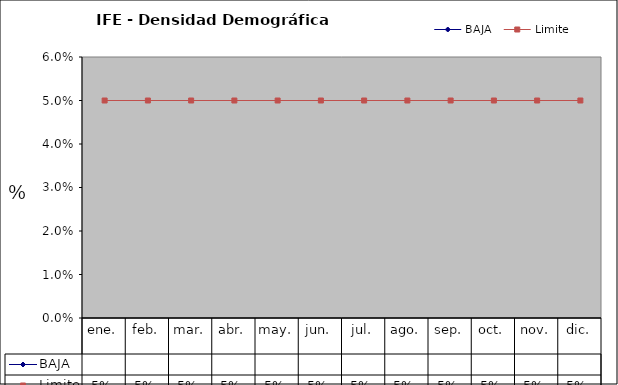
| Category | BAJA | Limite |
|---|---|---|
| ene. |  | 0.05 |
| feb. |  | 0.05 |
| mar. |  | 0.05 |
| abr. |  | 0.05 |
| may. |  | 0.05 |
| jun. |  | 0.05 |
| jul. |  | 0.05 |
| ago. |  | 0.05 |
| sep. |  | 0.05 |
| oct. |  | 0.05 |
| nov. |  | 0.05 |
| dic. |  | 0.05 |